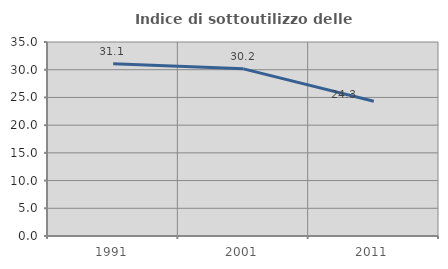
| Category | Indice di sottoutilizzo delle abitazioni  |
|---|---|
| 1991.0 | 31.061 |
| 2001.0 | 30.153 |
| 2011.0 | 24.299 |